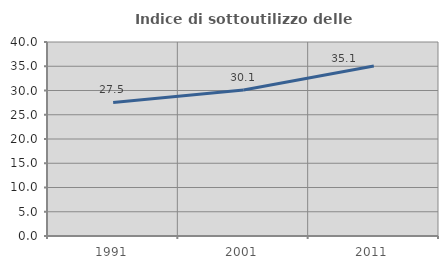
| Category | Indice di sottoutilizzo delle abitazioni  |
|---|---|
| 1991.0 | 27.536 |
| 2001.0 | 30.115 |
| 2011.0 | 35.052 |